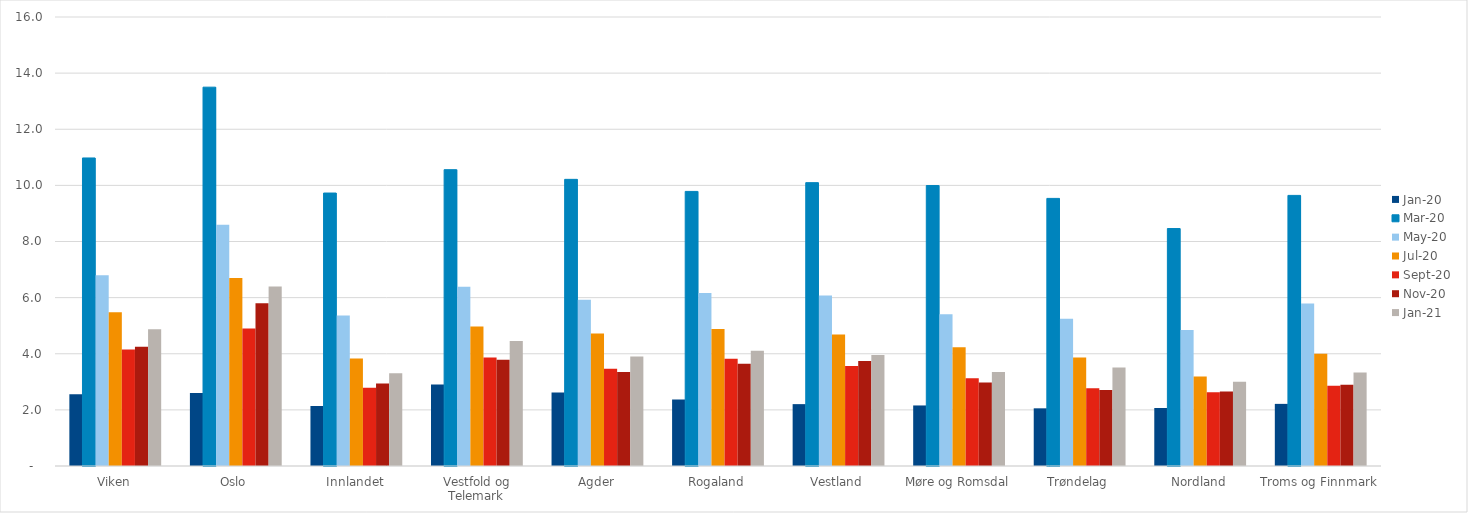
| Category | jan.20 | mar.20 | mai.20 | jul.20 | sep.20 | nov.20 | jan.21 |
|---|---|---|---|---|---|---|---|
| Viken | 2.554 | 10.977 | 6.798 | 5.475 | 4.148 | 4.253 | 4.871 |
| Oslo | 2.6 | 13.5 | 8.6 | 6.7 | 4.9 | 5.8 | 6.4 |
| Innlandet | 2.138 | 9.727 | 5.362 | 3.831 | 2.786 | 2.944 | 3.305 |
| Vestfold og Telemark | 2.908 | 10.559 | 6.384 | 4.969 | 3.871 | 3.783 | 4.454 |
| Agder | 2.616 | 10.215 | 5.924 | 4.723 | 3.469 | 3.348 | 3.905 |
| Rogaland | 2.37 | 9.785 | 6.169 | 4.88 | 3.825 | 3.641 | 4.104 |
| Vestland | 2.205 | 10.097 | 6.076 | 4.687 | 3.567 | 3.739 | 3.955 |
| Møre og Romsdal | 2.158 | 9.994 | 5.404 | 4.229 | 3.129 | 2.977 | 3.347 |
| Trøndelag | 2.055 | 9.536 | 5.247 | 3.865 | 2.773 | 2.709 | 3.512 |
| Nordland | 2.067 | 8.462 | 4.848 | 3.189 | 2.63 | 2.658 | 3.002 |
| Troms og Finnmark | 2.214 | 9.643 | 5.793 | 3.996 | 2.863 | 2.892 | 3.333 |